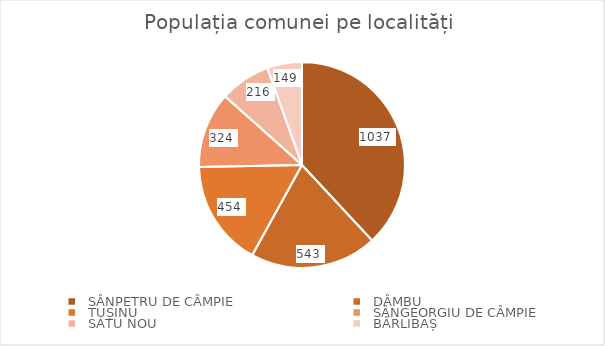
| Category | Series 0 |
|---|---|
|   SÂNPETRU DE CÂMPIE | 1037 |
|   DÂMBU | 543 |
|   TUȘINU | 454 |
|   SÂNGEORGIU DE CÂMPIE | 324 |
|   SATU NOU | 216 |
|   BÂRLIBAȘ | 149 |